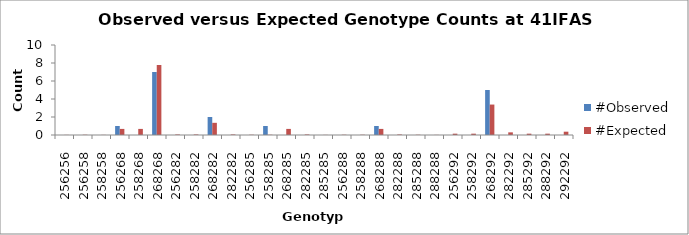
| Category | #Observed | #Expected |
|---|---|---|
| 256256.0 | 0 | 0.015 |
| 256258.0 | 0 | 0.029 |
| 258258.0 | 0 | 0.015 |
| 256268.0 | 1 | 0.676 |
| 258268.0 | 0 | 0.676 |
| 268268.0 | 7 | 7.779 |
| 256282.0 | 0 | 0.059 |
| 258282.0 | 0 | 0.059 |
| 268282.0 | 2 | 1.353 |
| 282282.0 | 0 | 0.059 |
| 256285.0 | 0 | 0.029 |
| 258285.0 | 1 | 0.029 |
| 268285.0 | 0 | 0.676 |
| 282285.0 | 0 | 0.059 |
| 285285.0 | 0 | 0.015 |
| 256288.0 | 0 | 0.029 |
| 258288.0 | 0 | 0.029 |
| 268288.0 | 1 | 0.676 |
| 282288.0 | 0 | 0.059 |
| 285288.0 | 0 | 0.029 |
| 288288.0 | 0 | 0.015 |
| 256292.0 | 0 | 0.147 |
| 258292.0 | 0 | 0.147 |
| 268292.0 | 5 | 3.382 |
| 282292.0 | 0 | 0.294 |
| 285292.0 | 0 | 0.147 |
| 288292.0 | 0 | 0.147 |
| 292292.0 | 0 | 0.368 |